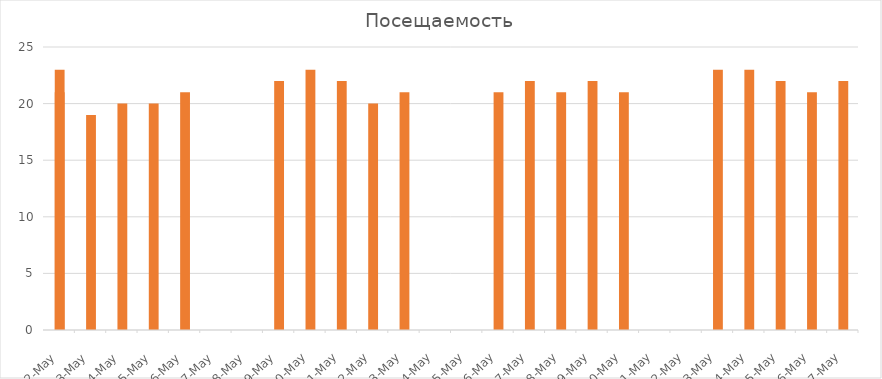
| Category | Series 0 |
|---|---|
| 2022-05-02 | 23 |
| 2022-05-03 | 19 |
| 2022-05-04 | 20 |
| 2022-05-05 | 20 |
| 2022-05-06 | 21 |
| 2022-05-02 | 21 |
| 2022-05-10 | 23 |
| 2022-05-11 | 22 |
| 2022-05-12 | 20 |
| 2022-05-13 | 21 |
| 2022-05-09 | 22 |
| 2022-05-17 | 22 |
| 2022-05-18 | 21 |
| 2022-05-19 | 22 |
| 2022-05-20 | 21 |
| 2022-05-16 | 21 |
| 2022-05-24 | 23 |
| 2022-05-25 | 22 |
| 2022-05-26 | 21 |
| 2022-05-27 | 22 |
| 2022-05-23 | 23 |